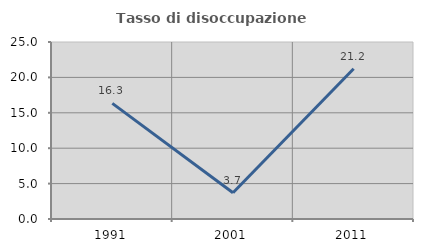
| Category | Tasso di disoccupazione giovanile  |
|---|---|
| 1991.0 | 16.327 |
| 2001.0 | 3.704 |
| 2011.0 | 21.212 |